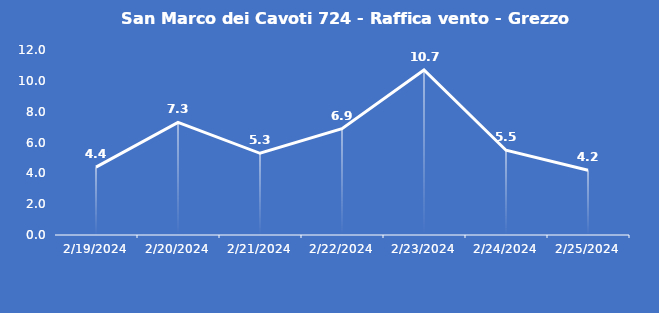
| Category | San Marco dei Cavoti 724 - Raffica vento - Grezzo (m/s) |
|---|---|
| 2/19/24 | 4.4 |
| 2/20/24 | 7.3 |
| 2/21/24 | 5.3 |
| 2/22/24 | 6.9 |
| 2/23/24 | 10.7 |
| 2/24/24 | 5.5 |
| 2/25/24 | 4.2 |